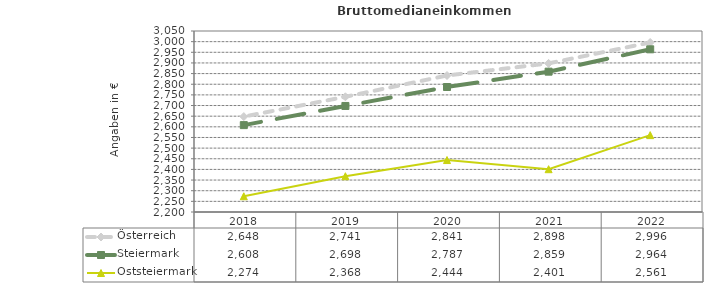
| Category | Österreich | Steiermark | Oststeiermark |
|---|---|---|---|
| 2022.0 | 2996 | 2964 | 2561 |
| 2021.0 | 2898 | 2859 | 2401 |
| 2020.0 | 2841 | 2787 | 2444 |
| 2019.0 | 2741 | 2698 | 2368 |
| 2018.0 | 2648 | 2608 | 2274 |